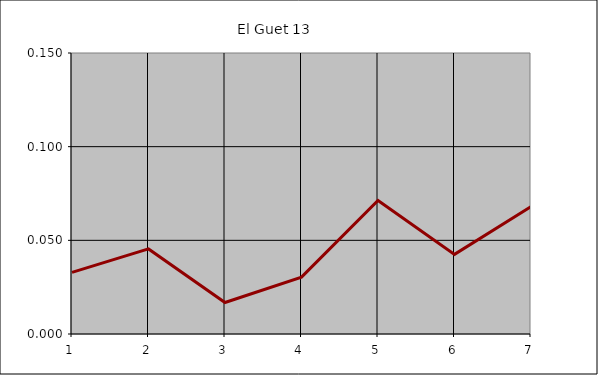
| Category | El Guet 13 |
|---|---|
| 1.0 | 0.033 |
| 2.0 | 0.045 |
| 3.0 | 0.017 |
| 4.0 | 0.03 |
| 5.0 | 0.071 |
| 6.0 | 0.043 |
| 7.0 | 0.068 |